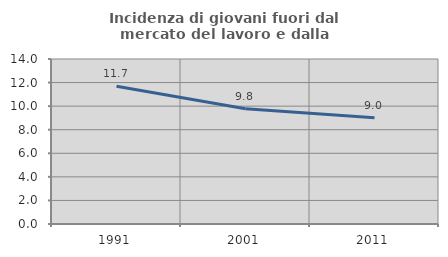
| Category | Incidenza di giovani fuori dal mercato del lavoro e dalla formazione  |
|---|---|
| 1991.0 | 11.686 |
| 2001.0 | 9.785 |
| 2011.0 | 9.024 |